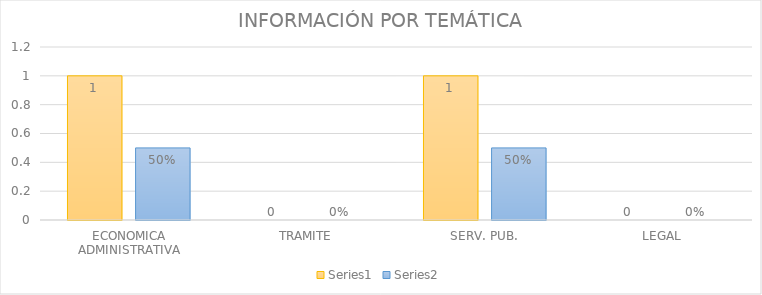
| Category | Series 3 | Series 4 |
|---|---|---|
| ECONOMICA ADMINISTRATIVA | 1 | 0.5 |
| TRAMITE | 0 | 0 |
| SERV. PUB. | 1 | 0.5 |
| LEGAL | 0 | 0 |